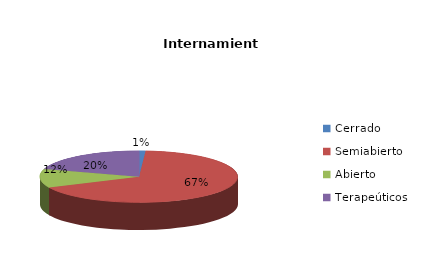
| Category | Series 0 |
|---|---|
| Cerrado | 1 |
| Semiabierto | 63 |
| Abierto | 11 |
| Terapeúticos | 19 |